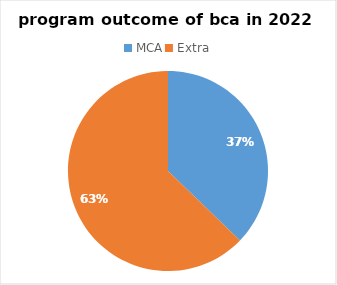
| Category | Series 0 |
|---|---|
| MCA | 16 |
| Extra | 27 |